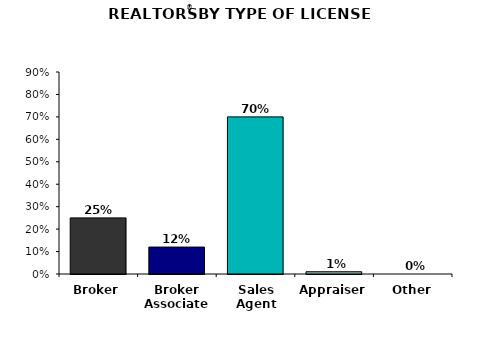
| Category | Series 0 |
|---|---|
| Broker | 25 |
| Broker Associate | 12 |
| Sales Agent | 70 |
| Appraiser | 1 |
| Other | 0 |